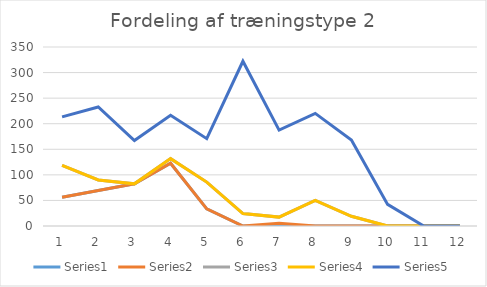
| Category | Series 0 | Series 1 | Series 2 | Series 3 | Series 4 |
|---|---|---|---|---|---|
| 0 | 56.23 | 0 | 62.24 | 0 | 94.84 |
| 1 | 69.35 | 0 | 20.74 | 0 | 142.61 |
| 2 | 82.44 | 0 | 0 | 0 | 84.57 |
| 3 | 122.8 | 0 | 8.94 | 0 | 84.77 |
| 4 | 33.57 | 0 | 52.29 | 0 | 84.9 |
| 5 | 0 | 0 | 24.3 | 0 | 297.84 |
| 6 | 0 | 5.16 | 12.23 | 0 | 170.1 |
| 7 | 0 | 0 | 50.05 | 0 | 170.09 |
| 8 | 0 | 0 | 19.03 | 0 | 149.26 |
| 9 | 0 | 0 | 0 | 0 | 42.25 |
| 10 | 0 | 0 | 0 | 0 | 0 |
| 11 | 0 | 0 | 0 | 0 | 0 |